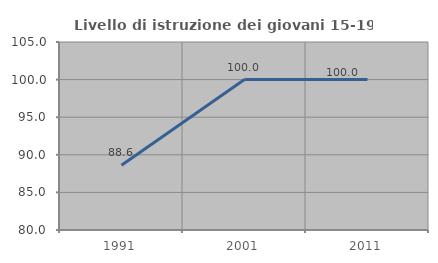
| Category | Livello di istruzione dei giovani 15-19 anni |
|---|---|
| 1991.0 | 88.608 |
| 2001.0 | 100 |
| 2011.0 | 100 |